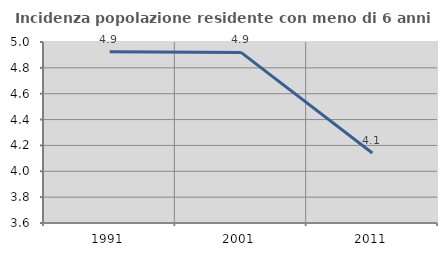
| Category | Incidenza popolazione residente con meno di 6 anni |
|---|---|
| 1991.0 | 4.925 |
| 2001.0 | 4.919 |
| 2011.0 | 4.142 |